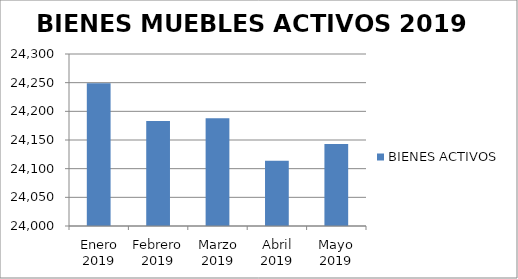
| Category | BIENES ACTIVOS |
|---|---|
| Enero 2019 | 24249 |
| Febrero 2019 | 24183 |
| Marzo 2019 | 24188 |
| Abril 2019 | 24114 |
| Mayo 2019 | 24143 |